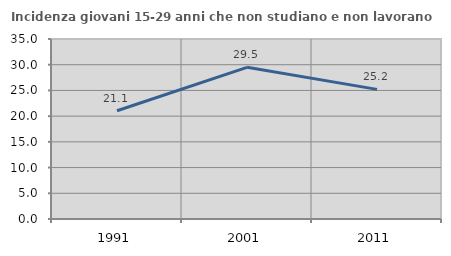
| Category | Incidenza giovani 15-29 anni che non studiano e non lavorano  |
|---|---|
| 1991.0 | 21.053 |
| 2001.0 | 29.488 |
| 2011.0 | 25.205 |